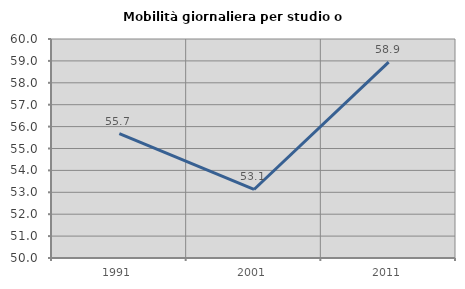
| Category | Mobilità giornaliera per studio o lavoro |
|---|---|
| 1991.0 | 55.683 |
| 2001.0 | 53.129 |
| 2011.0 | 58.945 |